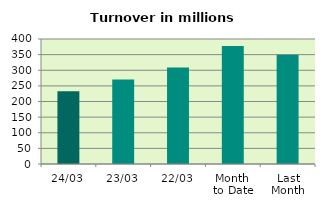
| Category | Series 0 |
|---|---|
| 24/03 | 232.467 |
| 23/03 | 270.143 |
| 22/03 | 308.748 |
| Month 
to Date | 377.902 |
| Last
Month | 349.641 |